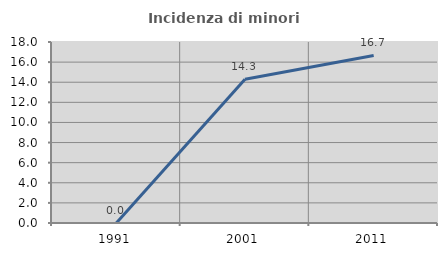
| Category | Incidenza di minori stranieri |
|---|---|
| 1991.0 | 0 |
| 2001.0 | 14.286 |
| 2011.0 | 16.667 |